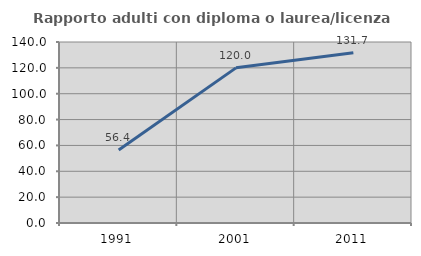
| Category | Rapporto adulti con diploma o laurea/licenza media  |
|---|---|
| 1991.0 | 56.41 |
| 2001.0 | 120 |
| 2011.0 | 131.7 |